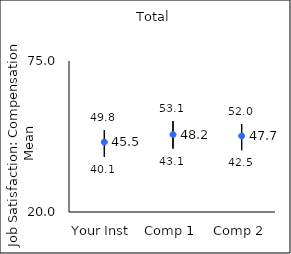
| Category | 25th percentile | 75th percentile | Mean |
|---|---|---|---|
| Your Inst | 40.1 | 49.8 | 45.46 |
| Comp 1 | 43.1 | 53.1 | 48.2 |
| Comp 2 | 42.5 | 52 | 47.71 |